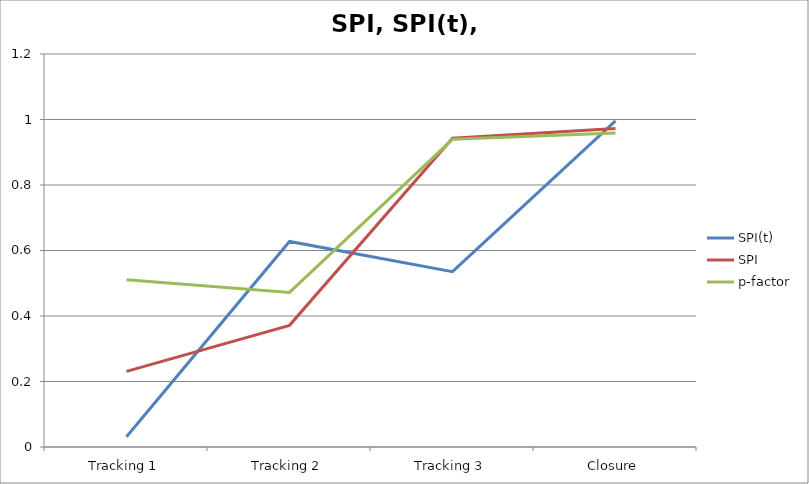
| Category | SPI(t) | SPI | p-factor |
|---|---|---|---|
| Tracking 1 | 0.031 | 0.231 | 0.511 |
| Tracking 2 | 0.628 | 0.372 | 0.472 |
| Tracking 3 | 0.535 | 0.943 | 0.94 |
| Closure | 0.996 | 0.972 | 0.959 |